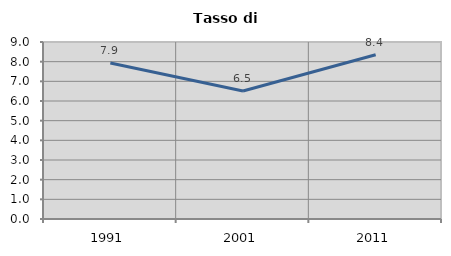
| Category | Tasso di disoccupazione   |
|---|---|
| 1991.0 | 7.932 |
| 2001.0 | 6.512 |
| 2011.0 | 8.354 |